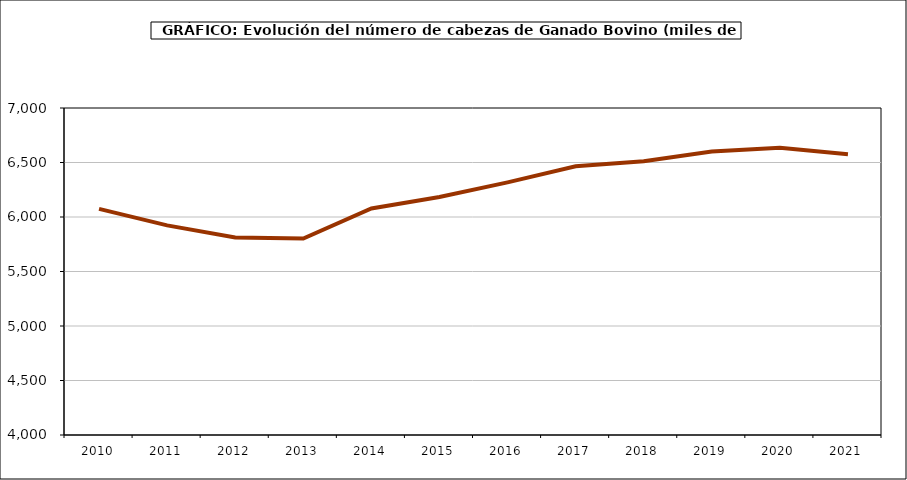
| Category | Series 0 |
|---|---|
| 2010.0 | 6075 |
| 2011.0 | 5923 |
| 2012.0 | 5812.605 |
| 2013.0 | 5802.22 |
| 2014.0 | 6078.733 |
| 2015.0 | 6182.908 |
| 2016.0 | 6317.641 |
| 2017.0 | 6465.747 |
| 2018.0 | 6510.592 |
| 2019.0 | 6600 |
| 2020.0 | 6636 |
| 2021.0 | 6576 |